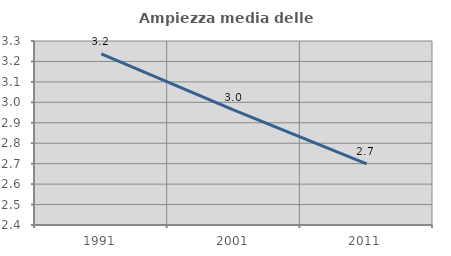
| Category | Ampiezza media delle famiglie |
|---|---|
| 1991.0 | 3.237 |
| 2001.0 | 2.961 |
| 2011.0 | 2.698 |